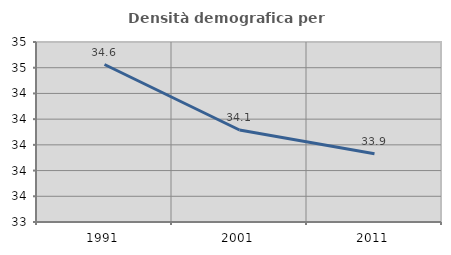
| Category | Densità demografica |
|---|---|
| 1991.0 | 34.625 |
| 2001.0 | 34.115 |
| 2011.0 | 33.93 |